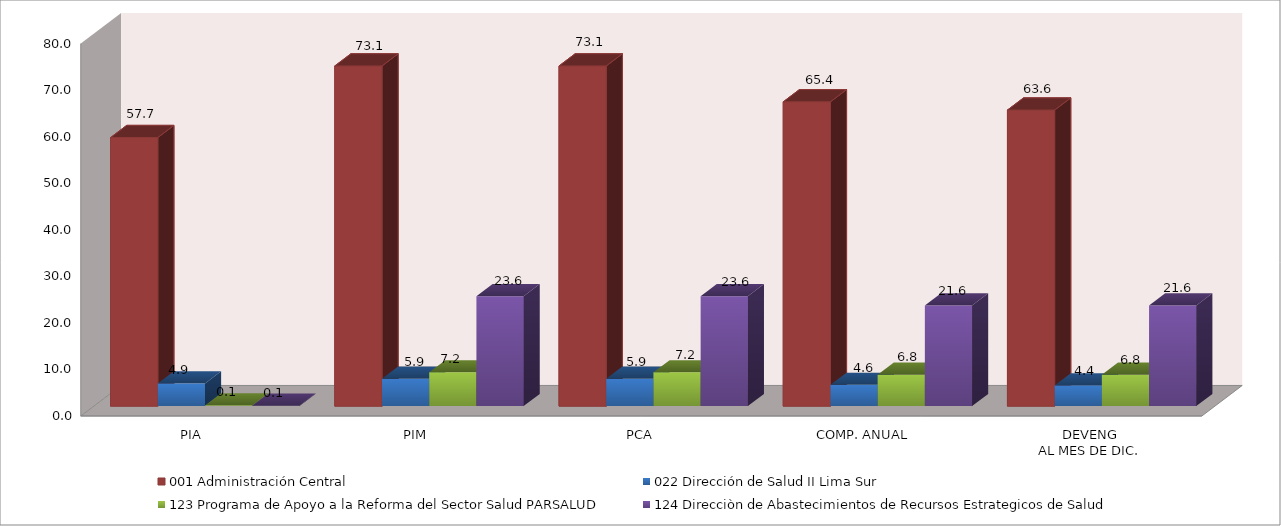
| Category | 001 Administración Central | 022 Dirección de Salud II Lima Sur | 123 Programa de Apoyo a la Reforma del Sector Salud PARSALUD | 124 Direcciòn de Abastecimientos de Recursos Estrategicos de Salud |
|---|---|---|---|---|
| PIA | 57.681 | 4.868 | 0.136 | 0.1 |
| PIM | 73.064 | 5.868 | 7.248 | 23.59 |
| PCA | 73.064 | 5.868 | 7.248 | 23.59 |
| COMP. ANUAL | 65.357 | 4.561 | 6.754 | 21.623 |
| DEVENG
AL MES DE DIC. | 63.59 | 4.427 | 6.754 | 21.623 |